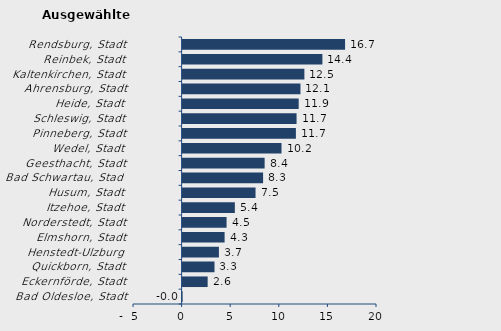
| Category | Wanderungssaldo |
|---|---|
| Bad Oldesloe, Stadt | -0.041 |
| Eckernförde, Stadt | 2.577 |
| Quickborn, Stadt | 3.282 |
| Henstedt-Ulzburg | 3.736 |
| Elmshorn, Stadt | 4.321 |
| Norderstedt, Stadt | 4.524 |
| Itzehoe, Stadt | 5.377 |
| Husum, Stadt | 7.504 |
| Bad Schwartau, Stadt | 8.282 |
| Geesthacht, Stadt | 8.44 |
| Wedel, Stadt | 10.176 |
| Pinneberg, Stadt | 11.656 |
| Schleswig, Stadt | 11.725 |
| Heide, Stadt | 11.944 |
| Ahrensburg, Stadt | 12.126 |
| Kaltenkirchen, Stadt | 12.529 |
| Reinbek, Stadt | 14.383 |
| Rendsburg, Stadt | 16.715 |